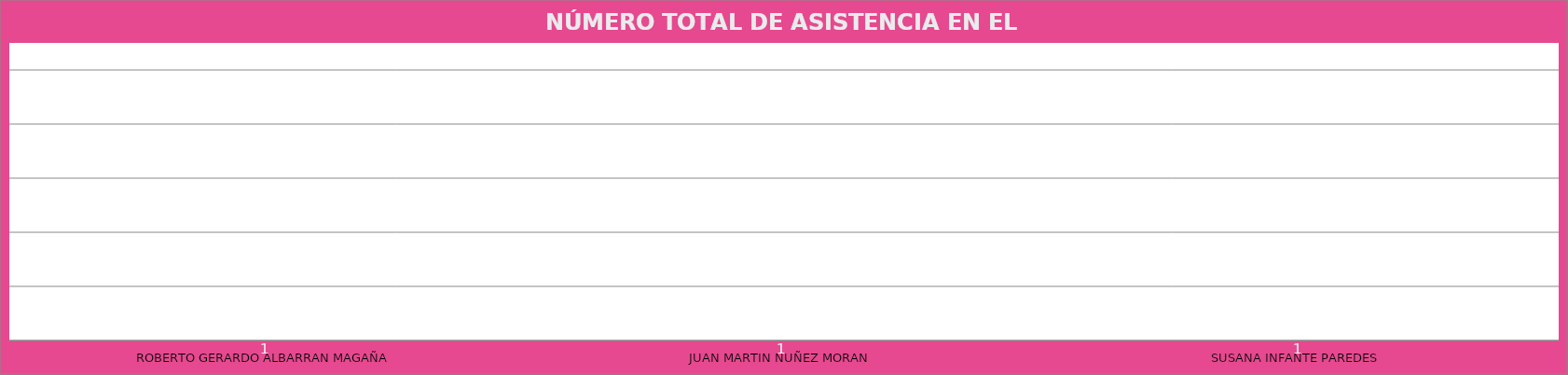
| Category | ROBERTO GERARDO ALBARRAN MAGAÑA |
|---|---|
| ROBERTO GERARDO ALBARRAN MAGAÑA | 1 |
| JUAN MARTIN NUÑEZ MORAN  | 1 |
| SUSANA INFANTE PAREDES  | 1 |